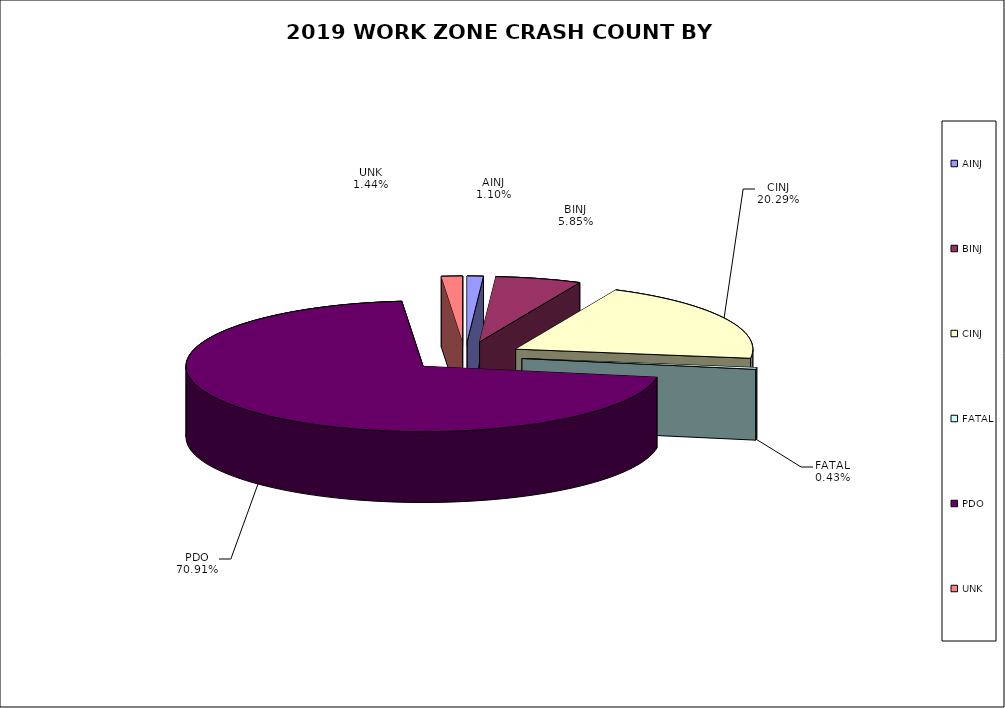
| Category | Series 0 | Series 1 |
|---|---|---|
| AINJ | 77 | 0.011 |
| BINJ | 411 | 0.058 |
| CINJ | 1426 | 0.203 |
| FATAL | 30 | 0.004 |
| PDO | 4984 | 0.709 |
| UNK | 101 | 0.014 |